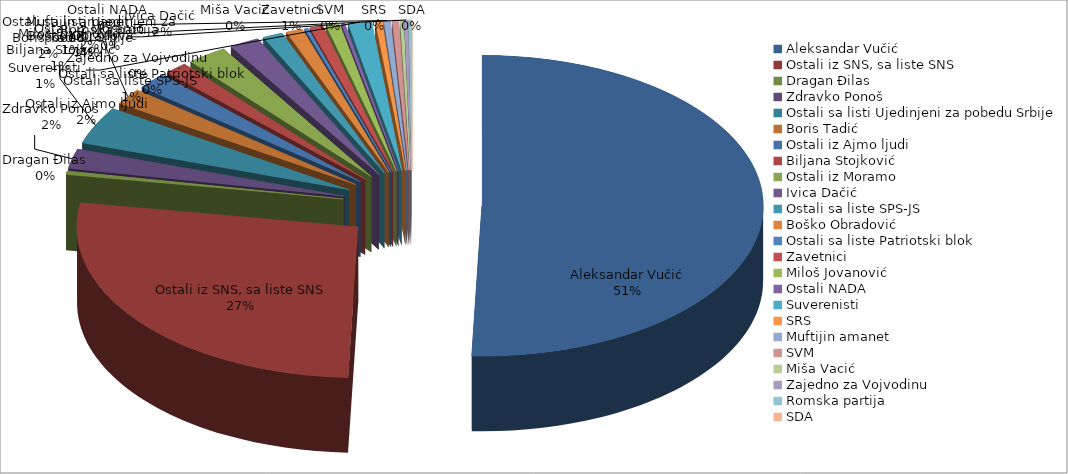
| Category | Series 0 |
|---|---|
| Aleksandar Vučić | 264 |
| Ostali iz SNS, sa liste SNS | 141 |
| Dragan Đilas | 2 |
| Zdravko Ponoš | 11 |
| Ostali sa listi Ujedinjeni za pobedu Srbije | 21 |
| Boris Tadić | 9 |
| Ostali iz Ajmo ljudi | 9 |
| Biljana Stojković | 7 |
| Ostali iz Moramo | 12 |
| Ivica Dačić  | 9 |
| Ostali sa liste SPS-JS | 6 |
| Boško Obradović | 5 |
| Ostali sa liste Patriotski blok | 1 |
| Zavetnici | 4 |
| Miloš Jovanović  | 4 |
| Ostali NADA | 1 |
| Suverenisti | 7 |
| SRS | 2 |
| Muftijin amanet | 2 |
| SVM | 2 |
| Miša Vacić | 1 |
| Zajedno za Vojvodinu | 1 |
| Romska partija | 1 |
| SDA | 0 |